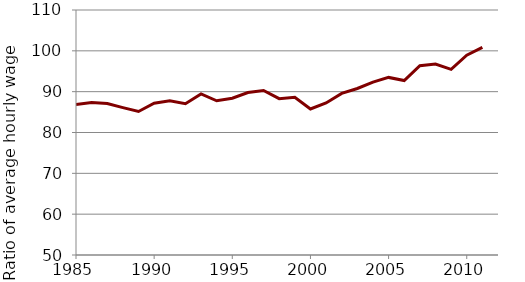
| Category | MALES |
|---|---|
| 1985.0 | 86.875 |
| 1986.0 | 87.333 |
| 1987.0 | 87.079 |
| 1988.0 | 86.097 |
| 1989.0 | 85.147 |
| 1990.0 | 87.156 |
| 1991.0 | 87.743 |
| 1992.0 | 87.065 |
| 1993.0 | 89.431 |
| 1994.0 | 87.766 |
| 1995.0 | 88.392 |
| 1996.0 | 89.787 |
| 1997.0 | 90.304 |
| 1998.0 | 88.279 |
| 1999.0 | 88.647 |
| 2000.0 | 85.76 |
| 2001.0 | 87.244 |
| 2002.0 | 89.583 |
| 2003.0 | 90.772 |
| 2004.0 | 92.341 |
| 2005.0 | 93.492 |
| 2006.0 | 92.719 |
| 2007.0 | 96.341 |
| 2008.0 | 96.756 |
| 2009.0 | 95.469 |
| 2010.0 | 98.93 |
| 2011.0 | 100.861 |